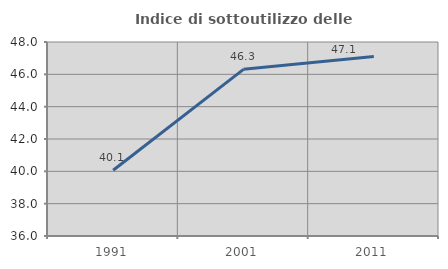
| Category | Indice di sottoutilizzo delle abitazioni  |
|---|---|
| 1991.0 | 40.07 |
| 2001.0 | 46.309 |
| 2011.0 | 47.097 |